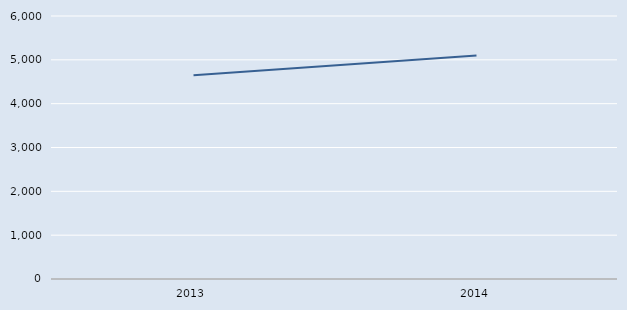
| Category | Series 0 |
|---|---|
| 2013.0 | 4651 |
| 2014.0 | 5098 |